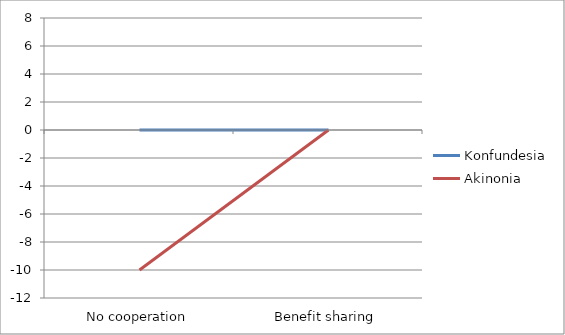
| Category | Konfundesia | Akinonia |
|---|---|---|
| No cooperation | 0 | -10 |
| Benefit sharing | 0 | 0 |